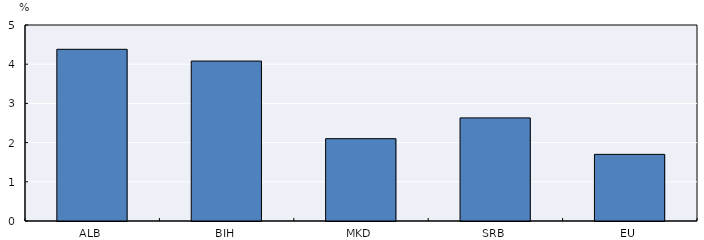
| Category | Series 2 |
|---|---|
| ALB | 4.38 |
| BIH | 4.08 |
| MKD | 2.1 |
| SRB | 2.63 |
| EU | 1.7 |